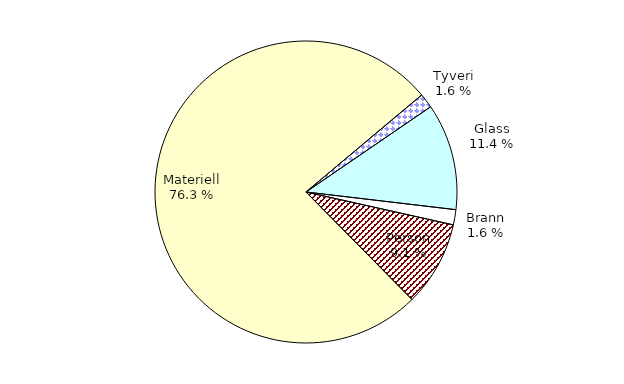
| Category | Series 0 |
|---|---|
| Tyveri | 217.489 |
| Glass | 1584.25 |
| Brann | 225.162 |
| Person | 1266.186 |
| Materiell | 10585.834 |